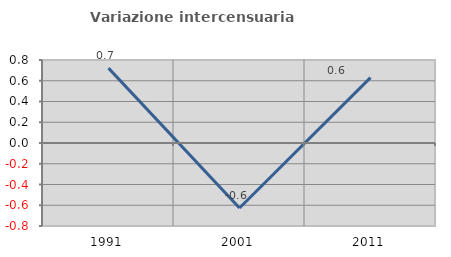
| Category | Variazione intercensuaria annua |
|---|---|
| 1991.0 | 0.722 |
| 2001.0 | -0.626 |
| 2011.0 | 0.63 |